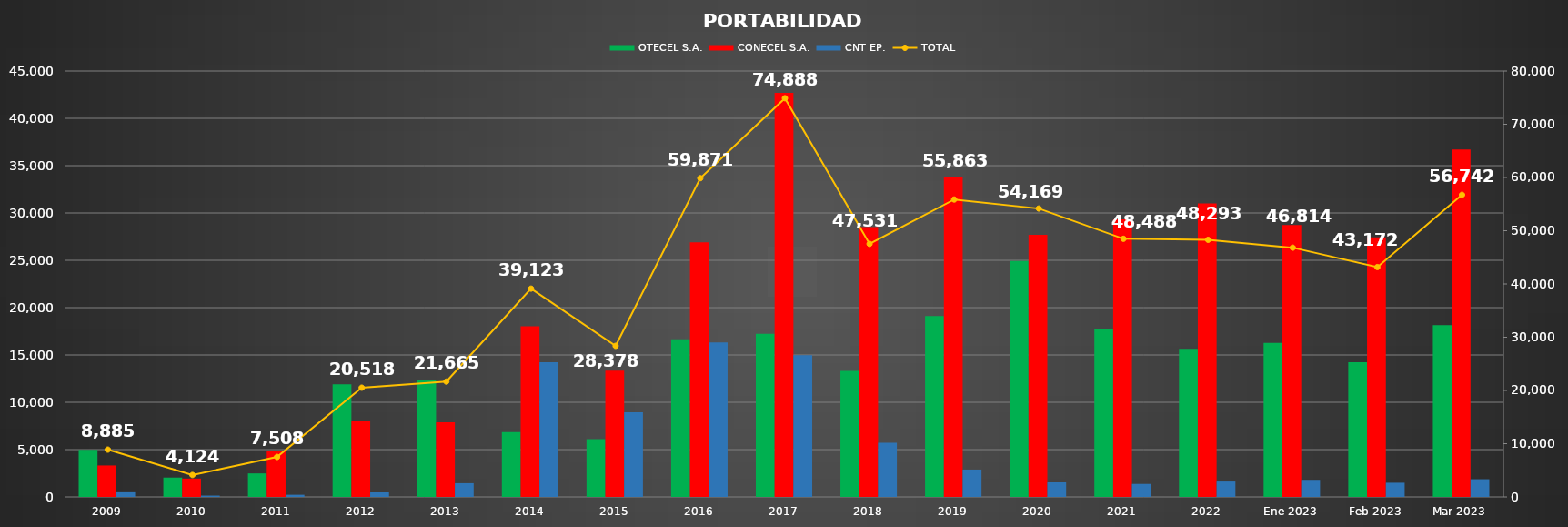
| Category | OTECEL S.A. | CONECEL S.A. | CNT EP. |
|---|---|---|---|
| 2009 | 4973 | 3324 | 588 |
| 2010 | 2045 | 1939 | 140 |
| 2011 | 2484 | 4796 | 228 |
| 2012 | 11894 | 8067 | 557 |
| 2013 | 12323 | 7893 | 1449 |
| 2014 | 6853 | 18039 | 14231 |
| 2015 | 6105 | 13334 | 8939 |
| 2016 | 16653 | 26907 | 16311 |
| 2017 | 17228 | 42694 | 14966 |
| 2018 | 13309 | 28504 | 5718 |
| 2019 | 19116 | 33857 | 2890 |
| 2020 | 24933 | 27700 | 1536 |
| 2021 | 17795 | 29321 | 1372 |
| 2022 | 15655 | 31012 | 1626 |
| Ene-2023 | 16278 | 28730 | 1806 |
| Feb-2023 | 14237 | 27438 | 1497 |
| Mar-2023 | 18159 | 36713 | 1870 |